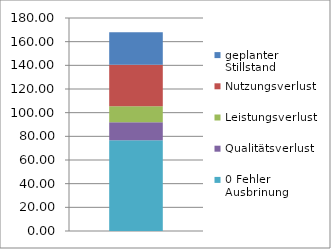
| Category | 0 Fehler Ausbrinung | Qualitätsverlust | Leistungsverlust | Nutzungsverlust | geplanter Stillstand |
|---|---|---|---|---|---|
| 0 | 76.667 | 15.333 | 13.5 | 35 | 27.5 |